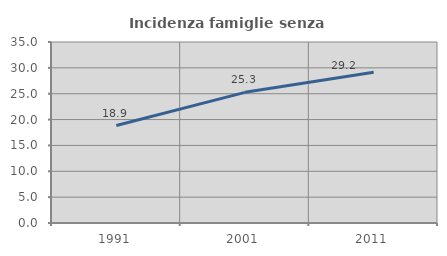
| Category | Incidenza famiglie senza nuclei |
|---|---|
| 1991.0 | 18.852 |
| 2001.0 | 25.267 |
| 2011.0 | 29.156 |